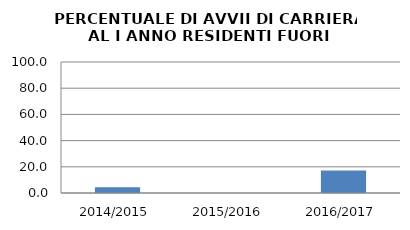
| Category | 2014/2015 2015/2016 2016/2017 |
|---|---|
| 2014/2015 | 4.348 |
| 2015/2016 | 0 |
| 2016/2017 | 17.143 |